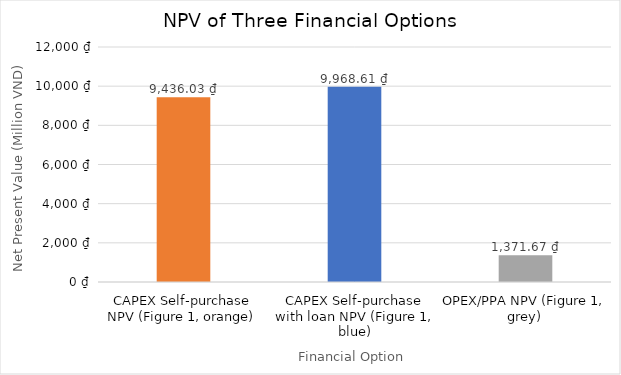
| Category | Series 0 |
|---|---|
| CAPEX Self-purchase NPV (Figure 1, orange) | 9436026765.578 |
| CAPEX Self-purchase with loan NPV (Figure 1, blue) | 9968610504.87 |
| OPEX/PPA NPV (Figure 1, grey) | 1371669391.199 |